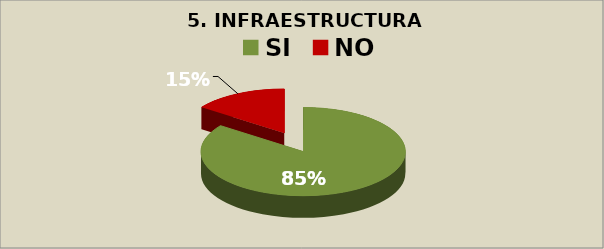
| Category | Series 0 |
|---|---|
| SI | 0.85 |
| NO | 0.15 |